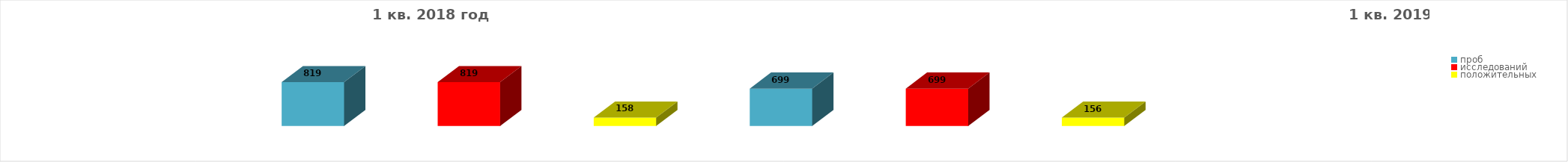
| Category | Series 4 |
|---|---|
| проб | 819 |
| исследований | 819 |
| положительных | 158 |
| проб | 699 |
| исследований | 699 |
| положительных | 156 |